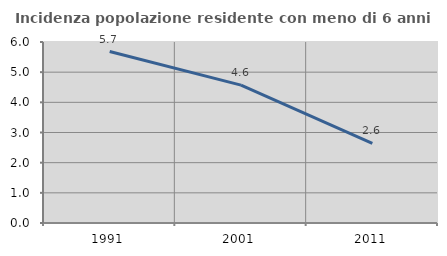
| Category | Incidenza popolazione residente con meno di 6 anni |
|---|---|
| 1991.0 | 5.683 |
| 2001.0 | 4.571 |
| 2011.0 | 2.643 |